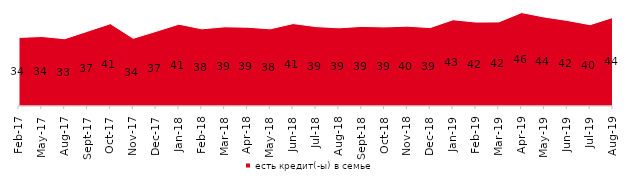
| Category | есть кредит(-ы) в семье |
|---|---|
| 2017-02-01 | 33.95 |
| 2017-05-01 | 34.4 |
| 2017-08-01 | 33.3 |
| 2017-09-01 | 37 |
| 2017-10-01 | 40.75 |
| 2017-11-01 | 33.5 |
| 2017-12-01 | 36.95 |
| 2018-01-01 | 40.5 |
| 2018-02-01 | 38.2 |
| 2018-03-01 | 39.2 |
| 2018-04-01 | 39 |
| 2018-05-01 | 38.2 |
| 2018-06-01 | 40.8 |
| 2018-07-01 | 39.3 |
| 2018-08-01 | 38.7 |
| 2018-09-01 | 39.4 |
| 2018-10-01 | 39.15 |
| 2018-11-01 | 39.521 |
| 2018-12-01 | 38.8 |
| 2019-01-01 | 42.7 |
| 2019-02-01 | 41.55 |
| 2019-03-01 | 41.621 |
| 2019-04-01 | 46.238 |
| 2019-05-01 | 44.032 |
| 2019-06-01 | 42.344 |
| 2019-07-01 | 40.248 |
| 2019-08-01 | 43.856 |